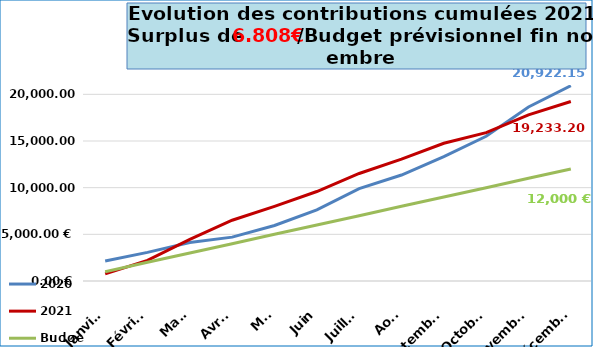
| Category | 2020 | 2021 | Budget |
|---|---|---|---|
| Janvier | 2149.91 | 765 | 1000 |
| Février | 3067.32 | 2216.19 | 2000 |
| Mars | 4115.08 | 4449.71 | 3000 |
| Avril | 4700.08 | 6512.23 | 4000 |
| Mai | 5943.88 | 7997.51 | 5000 |
| Juin | 7617.44 | 9585.8 | 6000 |
| Juillet | 9893.07 | 11521.71 | 7000 |
| Août | 11356.42 | 13060.62 | 8000 |
| Septembre | 13316.4 | 14759.91 | 9000 |
| Octobre | 15507.25 | 15895.29 | 10000 |
| Novembre | 18646.95 | 17808.45 | 11000 |
| Décembre | 20922.15 | 19233.2 | 12000 |